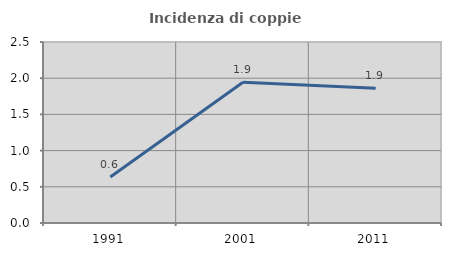
| Category | Incidenza di coppie miste |
|---|---|
| 1991.0 | 0.634 |
| 2001.0 | 1.944 |
| 2011.0 | 1.86 |